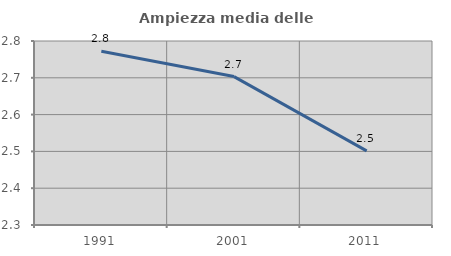
| Category | Ampiezza media delle famiglie |
|---|---|
| 1991.0 | 2.772 |
| 2001.0 | 2.703 |
| 2011.0 | 2.501 |